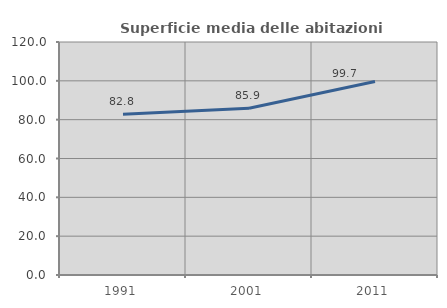
| Category | Superficie media delle abitazioni occupate |
|---|---|
| 1991.0 | 82.757 |
| 2001.0 | 85.901 |
| 2011.0 | 99.653 |